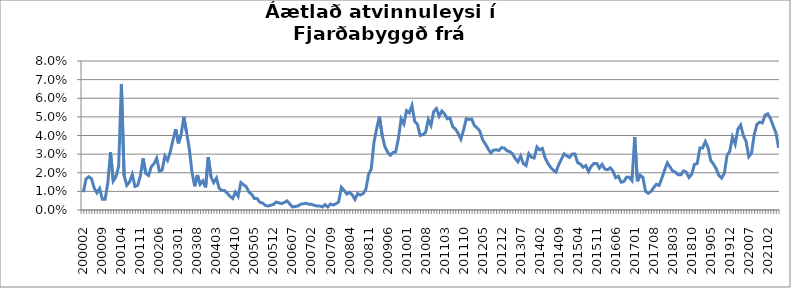
| Category | Series 0 |
|---|---|
| 200002 | 0.009 |
| 200003 | 0.017 |
| 200004 | 0.018 |
| 200005 | 0.017 |
| 200006 | 0.012 |
| 200007 | 0.009 |
| 200008 | 0.012 |
| 200009 | 0.006 |
| 200010 | 0.006 |
| 200011 | 0.014 |
| 200012 | 0.031 |
| 200101 | 0.016 |
| 200102 | 0.018 |
| 200103 | 0.024 |
| 200104 | 0.067 |
| 200105 | 0.018 |
| 200106 | 0.013 |
| 200107 | 0.015 |
| 200108 | 0.019 |
| 200109 | 0.013 |
| 200110 | 0.013 |
| 200111 | 0.018 |
| 200112 | 0.028 |
| 200201 | 0.02 |
| 200202 | 0.019 |
| 200203 | 0.023 |
| 200204 | 0.025 |
| 200205 | 0.028 |
| 200206 | 0.021 |
| 200207 | 0.021 |
| 200208 | 0.029 |
| 200209 | 0.027 |
| 200210 | 0.031 |
| 200211 | 0.038 |
| 200212 | 0.043 |
| 200301 | 0.036 |
| 200302 | 0.041 |
| 200303 | 0.05 |
| 200304 | 0.042 |
| 200305 | 0.033 |
| 200306 | 0.02 |
| 200307 | 0.013 |
| 200308 | 0.019 |
| 200309 | 0.014 |
| 200310 | 0.016 |
| 200311 | 0.012 |
| 200312 | 0.028 |
| 200401 | 0.018 |
| 200402 | 0.015 |
| 200403 | 0.017 |
| 200404 | 0.012 |
| 200405 | 0.01 |
| 200406 | 0.01 |
| 200407 | 0.009 |
| 200408 | 0.007 |
| 200409 | 0.006 |
| 200410 | 0.01 |
| 200411 | 0.007 |
| 200412 | 0.015 |
| 200501 | 0.014 |
| 200502 | 0.012 |
| 200503 | 0.01 |
| 200504 | 0.008 |
| 200505 | 0.006 |
| 200506 | 0.006 |
| 200507 | 0.004 |
| 200508 | 0.004 |
| 200509 | 0.002 |
| 200510 | 0.002 |
| 200511 | 0.003 |
| 200512 | 0.003 |
| 200601 | 0.004 |
| 200602 | 0.004 |
| 200603 | 0.003 |
| 200604 | 0.004 |
| 200605 | 0.005 |
| 200606 | 0.003 |
| 200607 | 0.002 |
| 200608 | 0.002 |
| 200609 | 0.002 |
| 200610 | 0.003 |
| 200611 | 0.003 |
| 200612 | 0.004 |
| 200701 | 0.003 |
| 200702 | 0.003 |
| 200703 | 0.003 |
| 200704 | 0.002 |
| 200705 | 0.002 |
| 200706 | 0.002 |
| 200707 | 0.003 |
| 200708 | 0.002 |
| 200709 | 0.003 |
| 200710 | 0.003 |
| 200711 | 0.003 |
| 200712 | 0.004 |
| 200801 | 0.012 |
| 200802 | 0.011 |
| 200803 | 0.009 |
| 200804 | 0.009 |
| 200805 | 0.008 |
| 200806 | 0.006 |
| 200807 | 0.009 |
| 200808 | 0.008 |
| 200809 | 0.009 |
| 200810 | 0.011 |
| 200811 | 0.019 |
| 200812 | 0.022 |
| 200901 | 0.036 |
| 200902 | 0.044 |
| 200903 | 0.05 |
| 200904 | 0.04 |
| 200905 | 0.034 |
| 200906 | 0.031 |
| 200907 | 0.029 |
| 200908 | 0.031 |
| 200909 | 0.031 |
| 200910 | 0.038 |
| 200911 | 0.049 |
| 200912 | 0.046 |
| 201001 | 0.053 |
| 201002 | 0.052 |
| 201003 | 0.056 |
| 201004 | 0.048 |
| 201005 | 0.046 |
| 201006 | 0.04 |
| 201007 | 0.04 |
| 201008 | 0.042 |
| 201009 | 0.049 |
| 201010 | 0.045 |
| 201011 | 0.053 |
| 201012 | 0.054 |
| 201101 | 0.05 |
| 201102 | 0.053 |
| 201103 | 0.052 |
| 201104 | 0.049 |
| 201105 | 0.049 |
| 201106 | 0.045 |
| 201107 | 0.043 |
| 201108 | 0.041 |
| 201109 | 0.038 |
| 201110 | 0.043 |
| 201111 | 0.049 |
| 201112 | 0.049 |
| 201201 | 0.049 |
| 201202 | 0.045 |
| 201203 | 0.044 |
| 201204 | 0.042 |
| 201205 | 0.038 |
| 201206 | 0.036 |
| 201207 | 0.033 |
| 201208 | 0.031 |
| 201209 | 0.032 |
| 201210 | 0.032 |
| 201211 | 0.032 |
| 201212 | 0.034 |
| 201301 | 0.033 |
| 201302 | 0.032 |
| 201303 | 0.031 |
| 201304 | 0.03 |
| 201305 | 0.028 |
| 201306 | 0.026 |
| 201307 | 0.029 |
| 201308 | 0.025 |
| 201309 | 0.024 |
| 201310 | 0.03 |
| 201311 | 0.028 |
| 201312 | 0.028 |
| 201401 | 0.034 |
| 201402 | 0.032 |
| 201403 | 0.033 |
| 201404 | 0.028 |
| 201405 | 0.025 |
| 201406 | 0.023 |
| 201407 | 0.021 |
| 201408 | 0.02 |
| 201409 | 0.024 |
| 201410 | 0.027 |
| 201411 | 0.03 |
| 201412 | 0.029 |
| 201501 | 0.028 |
| 201502 | 0.03 |
| 201503 | 0.03 |
| 201504 | 0.025 |
| 201505 | 0.025 |
| 201506 | 0.023 |
| 201507 | 0.024 |
| 201508 | 0.021 |
| 201509 | 0.023 |
| 201510 | 0.025 |
| 201511 | 0.025 |
| 201512 | 0.022 |
| 201601 | 0.025 |
| 201602 | 0.022 |
| 201603 | 0.022 |
| 201604 | 0.023 |
| 201605 | 0.021 |
| 201606 | 0.017 |
| 201607 | 0.018 |
| 201608 | 0.015 |
| 201609 | 0.015 |
| 201610 | 0.018 |
| 201611 | 0.018 |
| 201612 | 0.016 |
| 201701 | 0.039 |
| 201702 | 0.015 |
| 201703 | 0.019 |
| 201704 | 0.018 |
| 201705 | 0.01 |
| 201706 | 0.009 |
| 201707 | 0.01 |
| 201708 | 0.012 |
| 201709 | 0.014 |
| 201710 | 0.013 |
| 201711 | 0.017 |
| 201712 | 0.021 |
| 201801 | 0.025 |
| 201802 | 0.023 |
| 201803 | 0.021 |
| 201804 | 0.02 |
| 201805 | 0.019 |
| 201806 | 0.019 |
| 201807 | 0.021 |
| 201808 | 0.02 |
| 201809 | 0.017 |
| 201810 | 0.019 |
| 201811 | 0.025 |
| 201812 | 0.025 |
| 201901 | 0.033 |
| 201902 | 0.033 |
| 201903 | 0.037 |
| 201904 | 0.034 |
| 201905 | 0.026 |
| 201906 | 0.025 |
| 201907 | 0.022 |
| 201908 | 0.019 |
| 201909 | 0.017 |
| 201910 | 0.02 |
| 201911 | 0.029 |
| 201912 | 0.031 |
| 202001 | 0.039 |
| 202002 | 0.035 |
| 202003*** | 0.043 |
| 202004 | 0.046 |
| 202005 | 0.04 |
| 202006 | 0.037 |
| 202007 | 0.029 |
| 202008 | 0.03 |
| 202009 | 0.04 |
| 202010 | 0.046 |
| 202011 | 0.047 |
| 202012 | 0.047 |
| 202101 | 0.051 |
| 202102 | 0.052 |
| 202103 | 0.049 |
| 202104 | 0.045 |
| 202105 | 0.041 |
| 202106 | 0.033 |